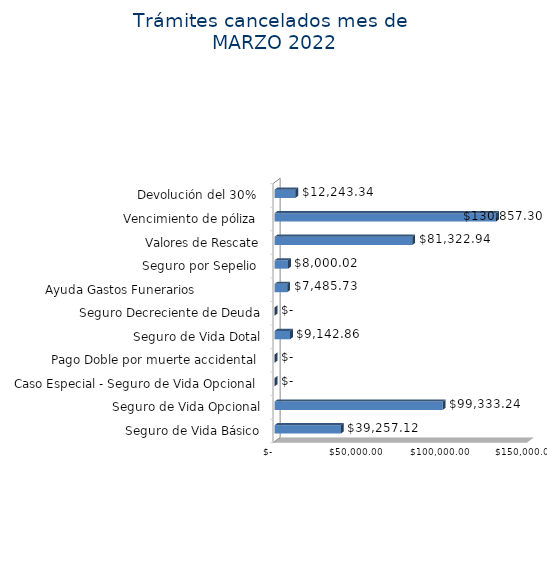
| Category | Monto  |
|---|---|
| Seguro de Vida Básico | 39257.12 |
| Seguro de Vida Opcional | 99333.24 |
| Caso Especial - Seguro de Vida Opcional  | 0 |
| Pago Doble por muerte accidental  | 0 |
| Seguro de Vida Dotal | 9142.86 |
| Seguro Decreciente de Deuda | 0 |
| Ayuda Gastos Funerarios                  | 7485.73 |
| Seguro por Sepelio  | 8000.02 |
| Valores de Rescate | 81322.94 |
| Vencimiento de póliza  | 130857.3 |
| Devolución del 30%  | 12243.34 |